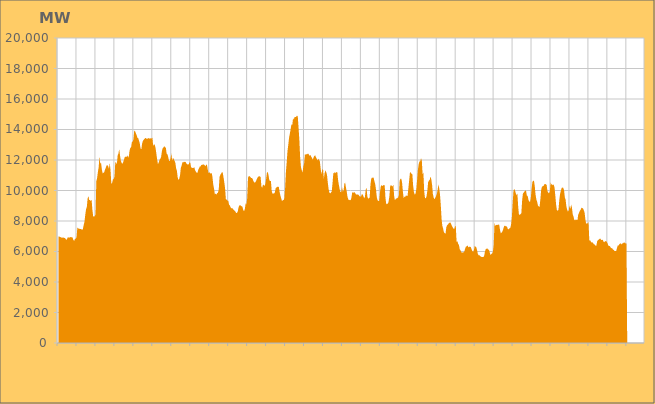
| Category | Series 0 |
|---|---|
|  | 6980.933 |
|  | 6987.627 |
|  | 6951.397 |
|  | 6934.339 |
|  | 6913.76 |
|  | 6899.893 |
|  | 6937.589 |
|  | 6881.432 |
|  | 6899.375 |
|  | 6834.535 |
|  | 6758.051 |
|  | 6824.413 |
|  | 6933.195 |
|  | 6911.408 |
|  | 6913.232 |
|  | 6935.118 |
|  | 6954.55 |
|  | 6917.493 |
|  | 6915.119 |
|  | 6744.909 |
|  | 6696.401 |
|  | 6830.207 |
|  | 6837.056 |
|  | 6946.298 |
|  | 7568.504 |
|  | 7507.686 |
|  | 7515.067 |
|  | 7467.239 |
|  | 7480.425 |
|  | 7467.263 |
|  | 7411.661 |
|  | 7478.543 |
|  | 7725.622 |
|  | 7937.003 |
|  | 8406.989 |
|  | 8762.587 |
|  | 8929.045 |
|  | 9478.431 |
|  | 9636.327 |
|  | 9374.994 |
|  | 9385.409 |
|  | 9294.361 |
|  | 9410.139 |
|  | 8750.075 |
|  | 8318.135 |
|  | 8281.941 |
|  | 8318.369 |
|  | 8429.394 |
|  | 10602.609 |
|  | 10824.159 |
|  | 11212.407 |
|  | 11534.195 |
|  | 12227.987 |
|  | 11778.964 |
|  | 11799.43 |
|  | 11392.34 |
|  | 11128.1 |
|  | 11164.337 |
|  | 11191.74 |
|  | 11377.989 |
|  | 11485.784 |
|  | 11639.789 |
|  | 11663.219 |
|  | 11596.311 |
|  | 11420.333 |
|  | 11812.492 |
|  | 11322.456 |
|  | 10442.964 |
|  | 10501.917 |
|  | 10722.604 |
|  | 10755.138 |
|  | 10898.548 |
|  | 11826.419 |
|  | 11850.475 |
|  | 11721.381 |
|  | 12301.022 |
|  | 12424.623 |
|  | 12717.185 |
|  | 12297.432 |
|  | 11960.926 |
|  | 11813.878 |
|  | 11750.883 |
|  | 11865.814 |
|  | 12010.549 |
|  | 12200.819 |
|  | 12217.905 |
|  | 12204.455 |
|  | 12232.267 |
|  | 12299.304 |
|  | 12133.619 |
|  | 12588.871 |
|  | 12794.314 |
|  | 12827.417 |
|  | 13165.477 |
|  | 13208.517 |
|  | 13350.659 |
|  | 13929.083 |
|  | 13895.157 |
|  | 13759.296 |
|  | 13636.078 |
|  | 13458.311 |
|  | 13434.669 |
|  | 13280.913 |
|  | 13088.673 |
|  | 12761.08 |
|  | 12711.379 |
|  | 13084.113 |
|  | 13259.5 |
|  | 13327.213 |
|  | 13394.249 |
|  | 13438.04 |
|  | 13433.034 |
|  | 13371.57 |
|  | 13413.231 |
|  | 13441.825 |
|  | 13406.112 |
|  | 13408.128 |
|  | 13424.92 |
|  | 13412.477 |
|  | 13461.579 |
|  | 12907.055 |
|  | 13050.639 |
|  | 12988.006 |
|  | 12787.183 |
|  | 12410.514 |
|  | 12028.148 |
|  | 11732.657 |
|  | 11829.912 |
|  | 12014.777 |
|  | 12074.113 |
|  | 12205.201 |
|  | 12570.415 |
|  | 12775.718 |
|  | 12822.96 |
|  | 12907.929 |
|  | 12833.391 |
|  | 12804.021 |
|  | 12427.293 |
|  | 12370.935 |
|  | 12201.033 |
|  | 11957.114 |
|  | 11922.798 |
|  | 12123.718 |
|  | 12423.261 |
|  | 11957.473 |
|  | 12140.135 |
|  | 12073.561 |
|  | 11948.581 |
|  | 11827.155 |
|  | 11466.098 |
|  | 11287.801 |
|  | 10855.744 |
|  | 10680.178 |
|  | 10779.764 |
|  | 11010.954 |
|  | 11490.332 |
|  | 11634.645 |
|  | 11858.119 |
|  | 11835.757 |
|  | 11886.513 |
|  | 11874.075 |
|  | 11879.492 |
|  | 11764.482 |
|  | 11723.736 |
|  | 11704.257 |
|  | 11716.485 |
|  | 11849.624 |
|  | 11802.132 |
|  | 11506.396 |
|  | 11504.53 |
|  | 11465.483 |
|  | 11472.796 |
|  | 11534.757 |
|  | 11326.034 |
|  | 11239.057 |
|  | 11169.052 |
|  | 11154.879 |
|  | 11362.556 |
|  | 11462.802 |
|  | 11580.61 |
|  | 11580.267 |
|  | 11684.767 |
|  | 11662.619 |
|  | 11731.502 |
|  | 11694.237 |
|  | 11666.587 |
|  | 11592.907 |
|  | 11690.395 |
|  | 11694.942 |
|  | 11401.426 |
|  | 11130.064 |
|  | 11209.77 |
|  | 11130.445 |
|  | 11119.262 |
|  | 11148.726 |
|  | 10887.508 |
|  | 10392.647 |
|  | 10135.619 |
|  | 9757.103 |
|  | 9799.902 |
|  | 9730.272 |
|  | 9824.775 |
|  | 9850.656 |
|  | 10095.591 |
|  | 10884.755 |
|  | 11031.419 |
|  | 11108.924 |
|  | 11209.499 |
|  | 11175.329 |
|  | 10873.552 |
|  | 10534.061 |
|  | 10138.419 |
|  | 9435.152 |
|  | 9399.663 |
|  | 9329.919 |
|  | 9336.426 |
|  | 9079.153 |
|  | 9021.757 |
|  | 8896.03 |
|  | 8822.178 |
|  | 8862.636 |
|  | 8778.873 |
|  | 8728.373 |
|  | 8675.754 |
|  | 8619.331 |
|  | 8514.501 |
|  | 8537.738 |
|  | 8607.876 |
|  | 8886.188 |
|  | 9021.613 |
|  | 9041.113 |
|  | 8994.864 |
|  | 8963.554 |
|  | 8932.296 |
|  | 8712.385 |
|  | 8643.133 |
|  | 8787.697 |
|  | 9157.66 |
|  | 9078.211 |
|  | 9506.461 |
|  | 10829.495 |
|  | 10948.884 |
|  | 10937.423 |
|  | 10885.985 |
|  | 10816.937 |
|  | 10824.316 |
|  | 10746.663 |
|  | 10599.804 |
|  | 10529.637 |
|  | 10524.137 |
|  | 10603.476 |
|  | 10724.468 |
|  | 10843.783 |
|  | 10913.264 |
|  | 10925.122 |
|  | 10937.296 |
|  | 10870.018 |
|  | 10243.862 |
|  | 10179.176 |
|  | 10407.713 |
|  | 10356.579 |
|  | 10301.489 |
|  | 10445.889 |
|  | 10779.8 |
|  | 11174.874 |
|  | 11218.173 |
|  | 10999.34 |
|  | 10669.454 |
|  | 10621.166 |
|  | 10619.326 |
|  | 9976.598 |
|  | 9783.955 |
|  | 9809.589 |
|  | 9805.117 |
|  | 9874.616 |
|  | 10146.056 |
|  | 10195.231 |
|  | 10242.13 |
|  | 10248.823 |
|  | 10233.212 |
|  | 9903.364 |
|  | 9667.111 |
|  | 9493.814 |
|  | 9303.068 |
|  | 9367.535 |
|  | 9370.978 |
|  | 9475.047 |
|  | 10195.383 |
|  | 11244.017 |
|  | 11850.035 |
|  | 12593.765 |
|  | 12993.933 |
|  | 13467.16 |
|  | 13736.337 |
|  | 14027.816 |
|  | 14337.651 |
|  | 14277.9 |
|  | 14732.786 |
|  | 14650.941 |
|  | 14827.098 |
|  | 14811.592 |
|  | 14838.84 |
|  | 14919.453 |
|  | 14859.141 |
|  | 14120.737 |
|  | 13315.846 |
|  | 12166.886 |
|  | 11537.518 |
|  | 11341.62 |
|  | 11174.059 |
|  | 11563.551 |
|  | 11765.907 |
|  | 12367.642 |
|  | 12366.76 |
|  | 12372.996 |
|  | 12379.418 |
|  | 12427.567 |
|  | 12358.228 |
|  | 12274.553 |
|  | 12336.033 |
|  | 12217.514 |
|  | 12141.186 |
|  | 12018.639 |
|  | 12176.922 |
|  | 12266.225 |
|  | 12306.679 |
|  | 12179.82 |
|  | 12080.978 |
|  | 11971.54 |
|  | 12082.305 |
|  | 12015.575 |
|  | 11903.002 |
|  | 11417.922 |
|  | 11064.646 |
|  | 11365.621 |
|  | 11401.584 |
|  | 10777.629 |
|  | 11147.405 |
|  | 11315.754 |
|  | 11208.976 |
|  | 11024.285 |
|  | 10514.602 |
|  | 10092.61 |
|  | 9863.385 |
|  | 9809.205 |
|  | 9861.135 |
|  | 9952.259 |
|  | 10488.584 |
|  | 11141.411 |
|  | 11130.278 |
|  | 11219.418 |
|  | 11126.971 |
|  | 11211.079 |
|  | 11218.936 |
|  | 10694.579 |
|  | 10367.431 |
|  | 10097.025 |
|  | 9900.938 |
|  | 9891.364 |
|  | 10242.266 |
|  | 9919.006 |
|  | 10010.683 |
|  | 10456.143 |
|  | 10505.344 |
|  | 10191.01 |
|  | 9915.671 |
|  | 9569.271 |
|  | 9409.159 |
|  | 9360.175 |
|  | 9396.308 |
|  | 9357.304 |
|  | 9560.993 |
|  | 9901.141 |
|  | 9845.627 |
|  | 9877.44 |
|  | 9886.289 |
|  | 9790.884 |
|  | 9735.812 |
|  | 9739.837 |
|  | 9745.584 |
|  | 9709.714 |
|  | 9628.204 |
|  | 9619.226 |
|  | 9594.962 |
|  | 9752.343 |
|  | 9750.018 |
|  | 9631.107 |
|  | 9495.672 |
|  | 9578.483 |
|  | 10058.208 |
|  | 10193.867 |
|  | 9627.274 |
|  | 9473.275 |
|  | 9485.371 |
|  | 9544.525 |
|  | 10392.836 |
|  | 10772.915 |
|  | 10849.109 |
|  | 10828.397 |
|  | 10846.55 |
|  | 10606.44 |
|  | 10421.378 |
|  | 10071.387 |
|  | 9569.585 |
|  | 9361.415 |
|  | 9308.651 |
|  | 9319.508 |
|  | 9850.46 |
|  | 10265.756 |
|  | 10353.818 |
|  | 10285.313 |
|  | 10337.938 |
|  | 10352.868 |
|  | 10342.357 |
|  | 9499.824 |
|  | 9085.552 |
|  | 9143.527 |
|  | 9121.457 |
|  | 9290.21 |
|  | 9649.938 |
|  | 10306.612 |
|  | 10349.642 |
|  | 10309.501 |
|  | 10263.847 |
|  | 10369.426 |
|  | 9623.295 |
|  | 9344.667 |
|  | 9458.99 |
|  | 9478.213 |
|  | 9501.12 |
|  | 9540.084 |
|  | 9696.854 |
|  | 10662.291 |
|  | 10769.347 |
|  | 10779.43 |
|  | 10524.5 |
|  | 9943.651 |
|  | 9506.848 |
|  | 9594.714 |
|  | 9579.318 |
|  | 9697.02 |
|  | 9631.915 |
|  | 9655.485 |
|  | 10155.484 |
|  | 10665.814 |
|  | 11185.621 |
|  | 11190.602 |
|  | 11089.28 |
|  | 11083.717 |
|  | 10333.395 |
|  | 9906.644 |
|  | 9736.454 |
|  | 9778.07 |
|  | 10083.467 |
|  | 10661.706 |
|  | 11325.001 |
|  | 11720.569 |
|  | 11902.066 |
|  | 11918.016 |
|  | 12112.486 |
|  | 11968.435 |
|  | 11072.525 |
|  | 11171.158 |
|  | 9971.364 |
|  | 9510.808 |
|  | 9485.198 |
|  | 9619.24 |
|  | 9976.133 |
|  | 10546.968 |
|  | 10652.137 |
|  | 10699.68 |
|  | 10915.874 |
|  | 10739.052 |
|  | 10369.547 |
|  | 9775.255 |
|  | 9533.573 |
|  | 9431.043 |
|  | 9515.388 |
|  | 9634.091 |
|  | 9768.243 |
|  | 10024.17 |
|  | 10392.598 |
|  | 10170.498 |
|  | 9750.667 |
|  | 9058.704 |
|  | 8140.633 |
|  | 7678.395 |
|  | 7496.443 |
|  | 7259.614 |
|  | 7211.715 |
|  | 7147.165 |
|  | 7596.152 |
|  | 7713.426 |
|  | 7767.007 |
|  | 7839.949 |
|  | 7883.391 |
|  | 7913.466 |
|  | 7809.524 |
|  | 7692.386 |
|  | 7596.752 |
|  | 7505.463 |
|  | 7472.512 |
|  | 7642.095 |
|  | 7685.388 |
|  | 6632.954 |
|  | 6671.457 |
|  | 6510.708 |
|  | 6416.083 |
|  | 6148.647 |
|  | 6075.126 |
|  | 5965.262 |
|  | 5905.69 |
|  | 5962.176 |
|  | 5940.745 |
|  | 6026.073 |
|  | 6217.462 |
|  | 6341.023 |
|  | 6331.866 |
|  | 6403.09 |
|  | 6265.579 |
|  | 6317.421 |
|  | 6314.122 |
|  | 6290.197 |
|  | 6145.978 |
|  | 6024.212 |
|  | 5979.683 |
|  | 6105.673 |
|  | 6375.091 |
|  | 6319.425 |
|  | 6273.704 |
|  | 6076.061 |
|  | 5835.562 |
|  | 5742.439 |
|  | 5757.594 |
|  | 5692.202 |
|  | 5663.831 |
|  | 5631.221 |
|  | 5634.596 |
|  | 5636.126 |
|  | 5727.066 |
|  | 6019.749 |
|  | 6159.545 |
|  | 6187.927 |
|  | 6195.723 |
|  | 6120.358 |
|  | 6123.986 |
|  | 5927.089 |
|  | 5767.271 |
|  | 5846.458 |
|  | 5865.903 |
|  | 5993.421 |
|  | 6429.136 |
|  | 7915.443 |
|  | 7681.178 |
|  | 7753.027 |
|  | 7729.827 |
|  | 7747.822 |
|  | 7770.241 |
|  | 7745.871 |
|  | 7411.619 |
|  | 7199.5 |
|  | 7243.302 |
|  | 7309.483 |
|  | 7459.61 |
|  | 7637.156 |
|  | 7699.621 |
|  | 7662.899 |
|  | 7657.452 |
|  | 7600.987 |
|  | 7461.328 |
|  | 7466.295 |
|  | 7519.097 |
|  | 7552.836 |
|  | 7770.455 |
|  | 8259.802 |
|  | 9154.71 |
|  | 9965.07 |
|  | 10110.965 |
|  | 9992.536 |
|  | 9811.906 |
|  | 9691.855 |
|  | 9789.048 |
|  | 8929.137 |
|  | 8403.252 |
|  | 8415.239 |
|  | 8452.453 |
|  | 8513.601 |
|  | 9356.59 |
|  | 9801.208 |
|  | 9864.615 |
|  | 9938.101 |
|  | 10012.865 |
|  | 9958.117 |
|  | 9666.167 |
|  | 9641.614 |
|  | 9371.276 |
|  | 9294.65 |
|  | 9240.716 |
|  | 9536.378 |
|  | 10131.177 |
|  | 10569.714 |
|  | 10634.317 |
|  | 10634.747 |
|  | 10271.997 |
|  | 9718.03 |
|  | 9407.844 |
|  | 9260.368 |
|  | 9013.053 |
|  | 8950.974 |
|  | 8913.754 |
|  | 9383.027 |
|  | 10003.924 |
|  | 10244.306 |
|  | 10281.804 |
|  | 10291.47 |
|  | 10399.412 |
|  | 10427.282 |
|  | 10406.105 |
|  | 10361.705 |
|  | 9965.581 |
|  | 9869.315 |
|  | 9810.838 |
|  | 9932.419 |
|  | 10524.533 |
|  | 10408.521 |
|  | 10396.018 |
|  | 10330.198 |
|  | 10407.893 |
|  | 10183.029 |
|  | 9655.019 |
|  | 9070.391 |
|  | 8708.297 |
|  | 8676.164 |
|  | 8742.026 |
|  | 9357.967 |
|  | 9776.213 |
|  | 9978.285 |
|  | 10164.029 |
|  | 10195.249 |
|  | 10180.51 |
|  | 10026.235 |
|  | 9560.657 |
|  | 9402.2 |
|  | 8954.727 |
|  | 8735.052 |
|  | 8615.36 |
|  | 8696.129 |
|  | 9016.334 |
|  | 8797.126 |
|  | 9060.038 |
|  | 8895.783 |
|  | 8440.98 |
|  | 8302.891 |
|  | 8040.118 |
|  | 8116.18 |
|  | 8043.391 |
|  | 8097.948 |
|  | 8056.285 |
|  | 8424.681 |
|  | 8535.869 |
|  | 8672.968 |
|  | 8730.212 |
|  | 8866.536 |
|  | 8849.379 |
|  | 8825.846 |
|  | 8710.102 |
|  | 8569.399 |
|  | 8111.763 |
|  | 7826.67 |
|  | 7831.738 |
|  | 7863.636 |
|  | 7938.346 |
|  | 6723.959 |
|  | 6736.174 |
|  | 6650.51 |
|  | 6581.376 |
|  | 6609.173 |
|  | 6527.431 |
|  | 6470.122 |
|  | 6452.551 |
|  | 6369.17 |
|  | 6391.07 |
|  | 6678 |
|  | 6752.447 |
|  | 6774.305 |
|  | 6831.391 |
|  | 6846.425 |
|  | 6764.941 |
|  | 6745.966 |
|  | 6780.528 |
|  | 6639.608 |
|  | 6607.382 |
|  | 6670.179 |
|  | 6684.008 |
|  | 6649.752 |
|  | 6546.742 |
|  | 6392.64 |
|  | 6347.467 |
|  | 6370.21 |
|  | 6266.038 |
|  | 6218.318 |
|  | 6219.111 |
|  | 6123.268 |
|  | 6106.835 |
|  | 6025.708 |
|  | 6026.366 |
|  | 6026.97 |
|  | 6222.912 |
|  | 6394.322 |
|  | 6390.123 |
|  | 6475.776 |
|  | 6518.487 |
|  | 6525.082 |
|  | 6456.108 |
|  | 6543.998 |
|  | 6546.784 |
|  | 6595.111 |
|  | 6573.834 |
|  | 6525.526 |
|  | 6531.009 |
|  | 0 |
|  | 0 |
|  | 0 |
|  | 0 |
|  | 0 |
|  | 0 |
|  | 0 |
|  | 0 |
|  | 0 |
|  | 0 |
|  | 0 |
|  | 0 |
|  | 0 |
|  | 0 |
|  | 0 |
|  | 0 |
|  | 0 |
|  | 0 |
|  | 0 |
|  | 0 |
|  | 0 |
|  | 0 |
|  | 0 |